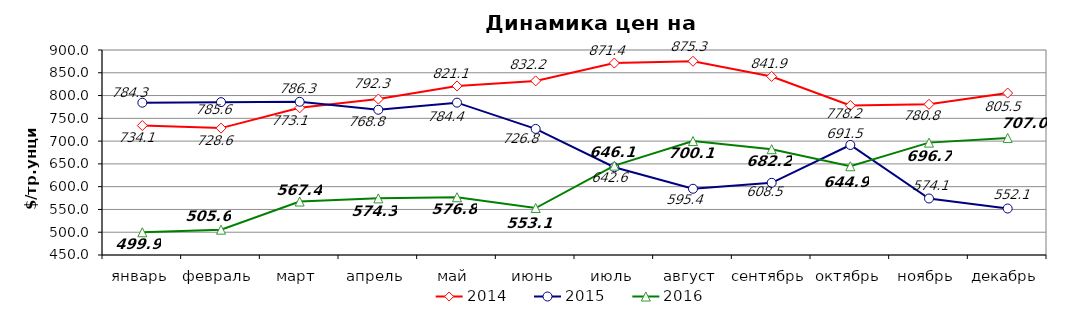
| Category | 2014 | 2015 | 2016 |
|---|---|---|---|
| январь | 734.14 | 784.33 | 499.9 |
| февраль | 728.55 | 785.55 | 505.57 |
| март | 773.07 | 786.32 | 567.38 |
| апрель | 792.33 | 768.8 | 574.33 |
| май | 821.05 | 784.42 | 576.75 |
| июнь | 832.19 | 726.77 | 553.09 |
| июль | 871.36 | 642.57 | 646.14 |
| август | 875.32 | 595.4 | 700.09 |
| сентябрь | 841.88 | 608.5 | 682.23 |
| октябрь | 778.24 | 691.5 | 644.85 |
| ноябрь | 780.75 | 574.05 | 696.68 |
| декабрь | 805.52 | 552.05 | 706.98 |